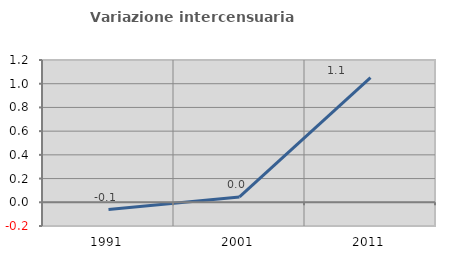
| Category | Variazione intercensuaria annua |
|---|---|
| 1991.0 | -0.062 |
| 2001.0 | 0.045 |
| 2011.0 | 1.052 |